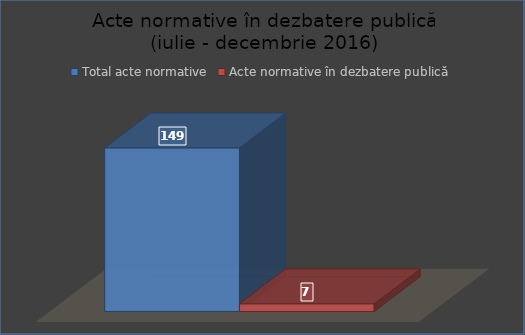
| Category | Total acte normative | Acte normative în dezbatere publică |
|---|---|---|
| 0 | 149 | 7 |